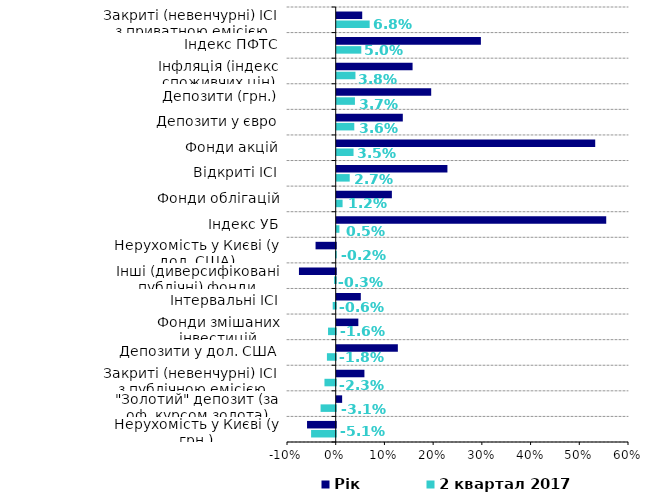
| Category | 2 квартал 2017 | Рік |
|---|---|---|
| Нерухомість у Києві (у грн.) | -0.051 | -0.059 |
| "Золотий" депозит (за оф. курсом золота) | -0.031 | 0.011 |
| Закриті (невенчурні) ІСІ з публічною емісією | -0.023 | 0.057 |
| Депозити у дол. США | -0.018 | 0.125 |
| Фонди змішаних інвестицій | -0.016 | 0.044 |
| Інтервальні ІСІ | -0.006 | 0.049 |
| Інші (диверсифіковані публічні) фонди | -0.003 | -0.075 |
| Нерухомість у Києві (у дол. США) | -0.002 | -0.041 |
| Індекс УБ | 0.005 | 0.553 |
| Фонди облігацій | 0.012 | 0.113 |
| Відкриті ІСІ | 0.027 | 0.227 |
| Фонди акцій | 0.035 | 0.531 |
| Депозити у євро | 0.036 | 0.136 |
| Депозити (грн.) | 0.037 | 0.194 |
| Інфляція (індекс споживчих цін) | 0.038 | 0.156 |
| Індекс ПФТС | 0.05 | 0.296 |
| Закриті (невенчурні) ІСІ з приватною емісією | 0.068 | 0.052 |